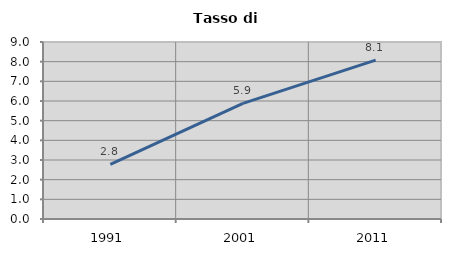
| Category | Tasso di disoccupazione   |
|---|---|
| 1991.0 | 2.778 |
| 2001.0 | 5.882 |
| 2011.0 | 8.081 |